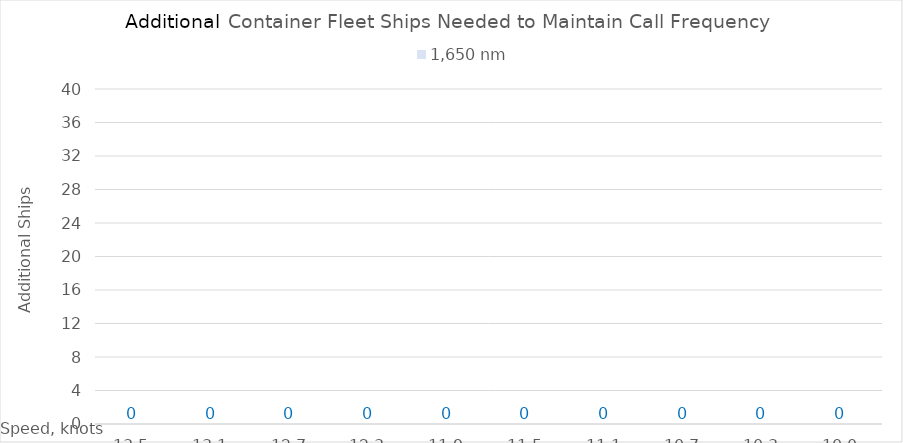
| Category | 1,650 |
|---|---|
| 13.5 | 0 |
| 13.1 | 0 |
| 12.7 | 0 |
| 12.299999999999999 | 0 |
| 11.899999999999999 | 0 |
| 11.499999999999998 | 0 |
| 11.099999999999998 | 0 |
| 10.699999999999998 | 0 |
| 10.299999999999997 | 0 |
| 10.0 | 0 |